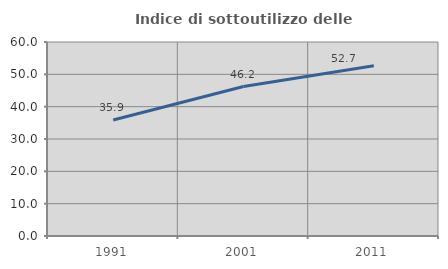
| Category | Indice di sottoutilizzo delle abitazioni  |
|---|---|
| 1991.0 | 35.882 |
| 2001.0 | 46.226 |
| 2011.0 | 52.662 |